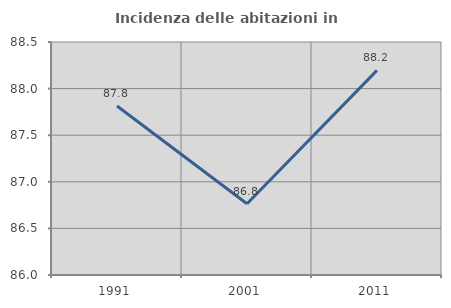
| Category | Incidenza delle abitazioni in proprietà  |
|---|---|
| 1991.0 | 87.814 |
| 2001.0 | 86.765 |
| 2011.0 | 88.196 |